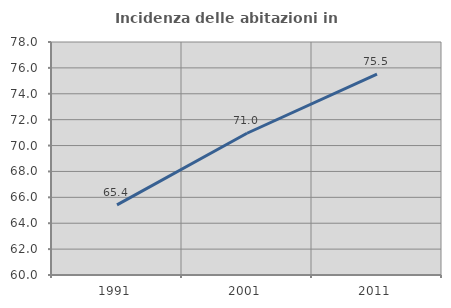
| Category | Incidenza delle abitazioni in proprietà  |
|---|---|
| 1991.0 | 65.415 |
| 2001.0 | 70.95 |
| 2011.0 | 75.523 |